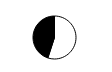
| Category | Series 0 |
|---|---|
| 0 | 0.55 |
| 1 | 0.45 |